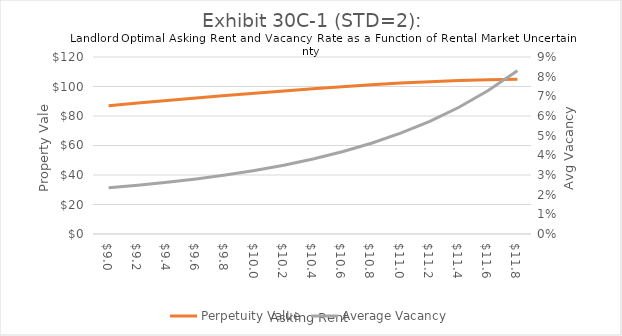
| Category | Perpetuity Value |
|---|---|
| 9.0 | 86.953 |
| 9.2 | 88.734 |
| 9.399999999999999 | 90.483 |
| 9.599999999999998 | 92.195 |
| 9.799999999999997 | 93.862 |
| 9.999999999999996 | 95.477 |
| 10.199999999999996 | 97.028 |
| 10.399999999999995 | 98.504 |
| 10.599999999999994 | 99.888 |
| 10.799999999999994 | 101.162 |
| 10.999999999999993 | 102.303 |
| 11.199999999999992 | 103.283 |
| 11.399999999999991 | 104.066 |
| 11.59999999999999 | 104.611 |
| 11.79999999999999 | 104.866 |